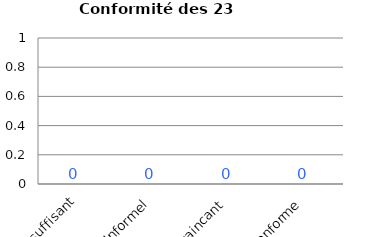
| Category | Histo Conformité |
|---|---|
| Insuffisant | 0 |
| Informel | 0 |
| Convaincant | 0 |
| Conforme | 0 |